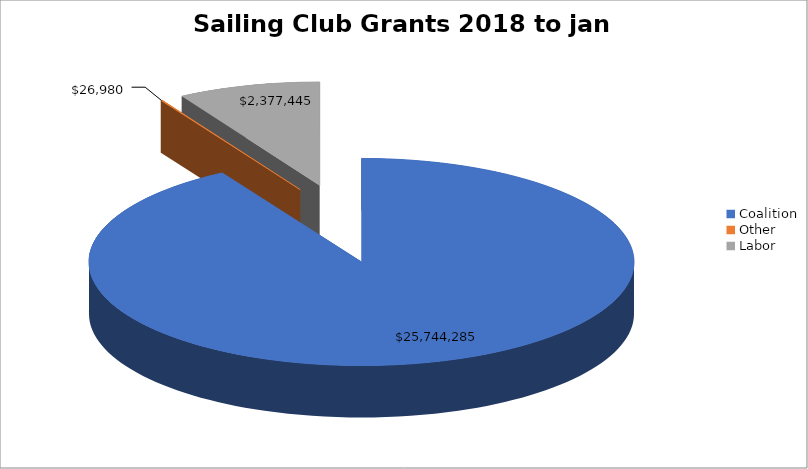
| Category | Sailing Club Grants 2018 to jan 2022 |
|---|---|
| Coalition | 25744284.6 |
| Other | 26980 |
| Labor | 2377445 |